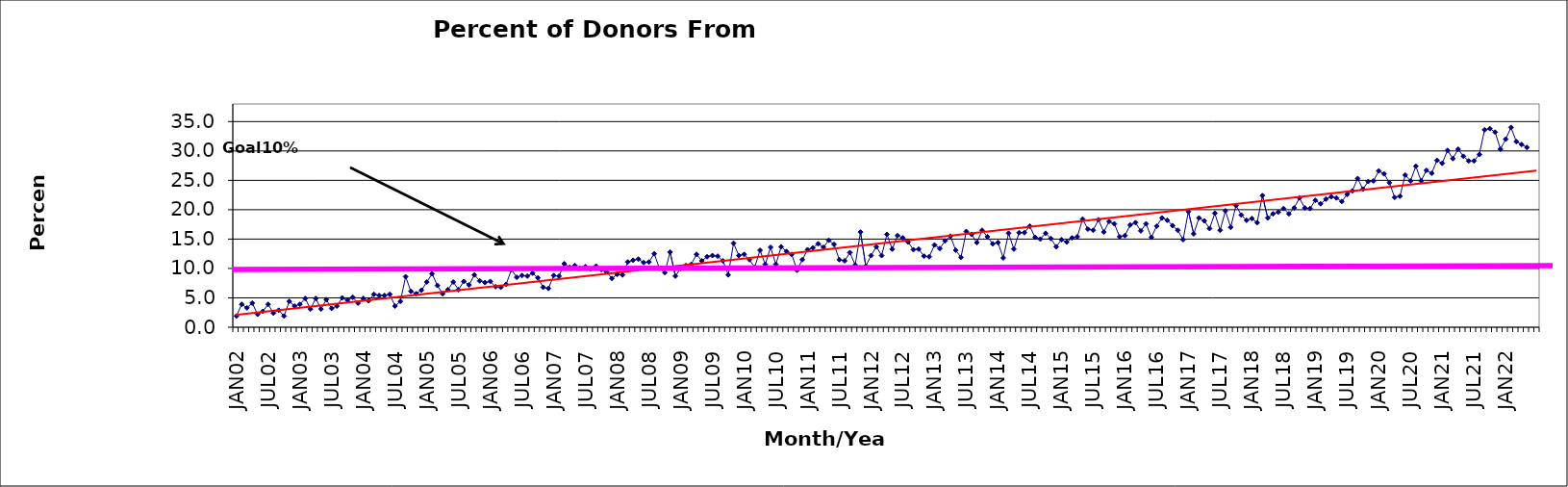
| Category | Series 0 |
|---|---|
| JAN02 | 1.9 |
| FEB02 | 3.9 |
| MAR02 | 3.3 |
| APR02 | 4.1 |
| MAY02 | 2.2 |
| JUN02 | 2.7 |
| JUL02 | 3.9 |
| AUG02 | 2.4 |
| SEP02 | 2.9 |
| OCT02 | 1.9 |
| NOV02 | 4.4 |
| DEC02 | 3.6 |
| JAN03 | 3.9 |
| FEB03 | 4.9 |
| MAR03 | 3.1 |
| APR03 | 4.9 |
| MAY03 | 3.1 |
| JUN03 | 4.7 |
| JUL03 | 3.2 |
| AUG03 | 3.6 |
| SEP03 | 5 |
| OCT03 | 4.6 |
| NOV03 | 5.1 |
| DEC03 | 4.1 |
| JAN04 | 4.9 |
| FEB04 | 4.5 |
| MAR04 | 5.6 |
| APR04 | 5.4 |
| MAY04 | 5.4 |
| JUN04 | 5.6 |
| JUL04 | 3.6 |
| AUG04 | 4.4 |
| SEP04 | 8.6 |
| OCT04 | 6.1 |
| NOV04 | 5.7 |
| DEC04 | 6.3 |
| JAN05 | 7.7 |
| FEB05 | 9.1 |
| MAR05 | 7.1 |
| APR05 | 5.7 |
| MAY05 | 6.4 |
| JUN05 | 7.7 |
| JUL05 | 6.4 |
| AUG05 | 7.8 |
| SEP05 | 7.2 |
| OCT05 | 8.9 |
| NOV05 | 7.9 |
| DEC05 | 7.6 |
| JAN06 | 7.8 |
| FEB06 | 6.9 |
| MAR06 | 6.8 |
| APR06 | 7.3 |
| MAY06 | 9.8 |
| JUN06 | 8.5 |
| JUL06 | 8.8 |
| AUG06 | 8.7 |
| SEP06 | 9.2 |
| OCT06 | 8.4 |
| NOV06 | 6.8 |
| DEC06 | 6.6 |
| JAN07 | 8.8 |
| FEB07 | 8.7 |
| MAR07 | 10.8 |
| APR07 | 10.2 |
| MAY07 | 10.5 |
| JUN07 | 10 |
| JUL07 | 10.3 |
| AUG07 | 9.9 |
| SEP07 | 10.4 |
| OCT07 | 9.8 |
| NOV07 | 9.4 |
| DEC07 | 8.3 |
| JAN08 | 9 |
| FEB08 | 8.9 |
| MAR08 | 11.1 |
| APR08 | 11.4 |
| MAY08 | 11.6 |
| JUN08 | 11 |
| JUL08 | 11.1 |
| AUG08 | 12.5 |
| SEP08 | 10 |
| OCT08 | 9.3 |
| NOV08 | 12.8 |
| DEC08 | 8.7 |
| JAN09 | 10 |
| FEB09 | 10.5 |
| MAR09 | 10.7 |
| APR09 | 12.4 |
| MAY09 | 11.3 |
| JUN09 | 12 |
| JUL09 | 12.2 |
| AUG09 | 12.1 |
| SEP09 | 11.3 |
| OCT09 | 8.9 |
| NOV09 | 14.3 |
| DEC09 | 12.2 |
| JAN10 | 12.4 |
| FEB10 | 11.5 |
| MAR10 | 10.2 |
| APR10 | 13.1 |
| MAY10 | 10.7 |
| JUN10 | 13.6 |
| JUL10 | 10.7 |
| AUG10 | 13.7 |
| SEP10 | 12.9 |
| OCT10 | 12.4 |
| NOV10 | 9.7 |
| DEC10 | 11.5 |
| JAN11 | 13.2 |
| FEB11 | 13.5 |
| MAR11 | 14.2 |
| APR11 | 13.6 |
| MAY11 | 14.8 |
| JUN11 | 14.1 |
| JUL11 | 11.5 |
| AUG11 | 11.3 |
| SEP11 | 12.7 |
| OCT11 | 10.6 |
| NOV11 | 16.2 |
| DEC11 | 10.4 |
| JAN12 | 12.2 |
| FEB12 | 13.7 |
| MAR12 | 12.2 |
| APR12 | 15.8 |
| MAY12 | 13.3 |
| JUN12 | 15.6 |
| JUL12 | 15.2 |
| AUG12 | 14.5 |
| SEP12 | 13.2 |
| OCT12 | 13.3 |
| NOV12 | 12.1 |
| DEC12 | 12 |
| JAN13 | 14 |
| FEB13 | 13.4 |
| MAR13 | 14.7 |
| APR13 | 15.5 |
| MAY13 | 13.1 |
| JUN13 | 11.9 |
| JUL13 | 16.3 |
| AUG13 | 15.8 |
| SEP13 | 14.4 |
| OCT13 | 16.5 |
| NOV13 | 15.4 |
| DEC13 | 14.2 |
| JAN14 | 14.4 |
| FEB14 | 11.8 |
| MAR14 | 16 |
| APR14 | 13.3 |
| MAY14 | 16.1 |
| JUN14 | 16.1 |
| JUL14 | 17.2 |
| AUG14 | 15.3 |
| SEP14 | 15 |
| OCT14 | 16 |
| NOV14 | 15.1 |
| DEC14 | 13.7 |
| JAN15 | 14.9 |
| FEB15 | 14.5 |
| MAR15 | 15.2 |
| APR15 | 15.4 |
| MAY15 | 18.4 |
| JUN15 | 16.7 |
| JUL15 | 16.5 |
| AUG15 | 18.3 |
| SEP15 | 16.2 |
| OCT15 | 18 |
| NOV15 | 17.6 |
| DEC15 | 15.4 |
| JAN16 | 15.6 |
| FEB16 | 17.4 |
| MAR16 | 17.8 |
| APR16 | 16.4 |
| MAY16 | 17.6 |
| JUN16 | 15.3 |
| JUL16 | 17.2 |
| AUG16 | 18.6 |
| SEP16 | 18.2 |
| OCT16 | 17.3 |
| NOV16 | 16.5 |
| DEC16 | 14.9 |
| JAN17 | 19.7 |
| FEB17 | 15.9 |
| MAR17 | 18.6 |
| APR17 | 18.1 |
| MAY17 | 16.8 |
| JUN17 | 19.4 |
| JUL17 | 16.5 |
| AUG17 | 19.8 |
| SEP17 | 17 |
| OCT17 | 20.7 |
| NOV17 | 19.1 |
| DEC17 | 18.2 |
| JAN18 | 18.5 |
| FEB18 | 17.8 |
| MAR18 | 22.4 |
| APR18 | 18.6 |
| MAY18 | 19.3 |
| JUN18 | 19.6 |
| JUL18 | 20.2 |
| AUG18 | 19.3 |
| SEP18 | 20.3 |
| OCT18 | 22 |
| NOV18 | 20.3 |
| DEC18 | 20.2 |
| JAN19 | 21.6 |
| FEB19 | 21 |
| MAR19 | 21.8 |
| APR19 | 22.2 |
| MAY19 | 22 |
| JUN19 | 21.4 |
| JUL19 | 22.6 |
| AUG19 | 23.2 |
| SEP19 | 25.3 |
| OCT19 | 23.5 |
| NOV19 | 24.8 |
| DEC19 | 24.9 |
| JAN20 | 26.6 |
| FEB20 | 26.1 |
| MAR20 | 24.6 |
| APR20 | 22.1 |
| MAY20 | 22.3 |
| JUN20 | 25.9 |
| JUL20 | 24.9 |
| AUG20 | 27.4 |
| SEP20 | 24.9 |
| OCT20 | 26.7 |
| NOV20 | 26.2 |
| DEC20 | 28.4 |
| JAN21 | 27.9 |
| FEB21 | 30.1 |
| MAR21 | 28.7 |
| APR21 | 30.3 |
| MAY21 | 29.1 |
| JUN21 | 28.3 |
| JUL21 | 28.3 |
| AUG21 | 29.4 |
| SEP21 | 33.6 |
| OCT21 | 33.8 |
| NOV21 | 33.2 |
| DEC21 | 30.3 |
| JAN22 | 32 |
| FEB22 | 34 |
| MAR22 | 31.6 |
| APR22 | 31.1 |
| MAY22 | 30.6 |